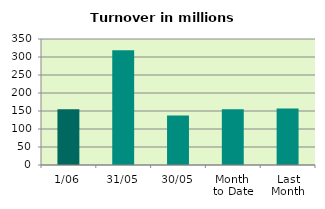
| Category | Series 0 |
|---|---|
| 1/06 | 154.8 |
| 31/05 | 318.935 |
| 30/05 | 137.217 |
| Month 
to Date | 154.8 |
| Last
Month | 157.265 |